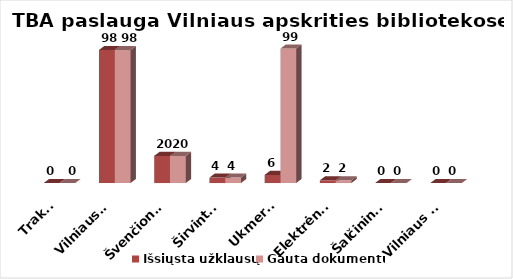
| Category | Išsiųsta užklausų | Gauta dokumentų |
|---|---|---|
| Trakai | 0 | 0 |
| Vilniaus r. | 98 | 98 |
| Švenčionys | 20 | 20 |
| Širvintos | 4 | 4 |
| Ukmergė | 6 | 99 |
| Elektrėnai | 2 | 2 |
| Šalčininkai | 0 | 0 |
| Vilniaus m. | 0 | 0 |